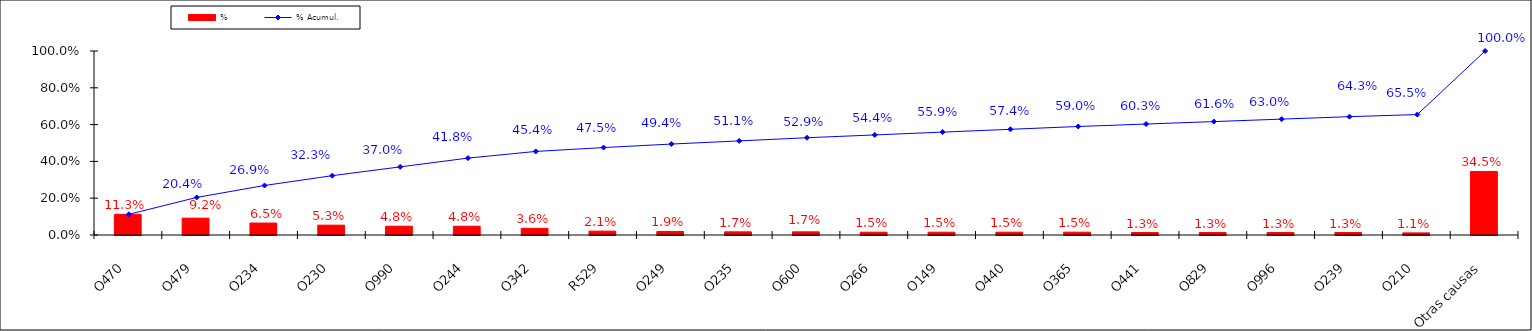
| Category | % |
|---|---|
| O470 | 0.113 |
| O479 | 0.092 |
| O234 | 0.065 |
| O230 | 0.053 |
| O990 | 0.048 |
| O244 | 0.048 |
| O342 | 0.036 |
| R529 | 0.021 |
| O249 | 0.019 |
| O235 | 0.017 |
| O600 | 0.017 |
| O266 | 0.015 |
| O149 | 0.015 |
| O440 | 0.015 |
| O365 | 0.015 |
| O441 | 0.013 |
| O829 | 0.013 |
| O996 | 0.013 |
| O239 | 0.013 |
| O210 | 0.011 |
| Otras causas | 0.345 |